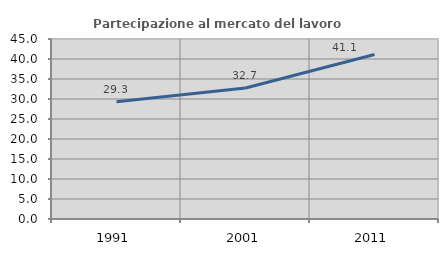
| Category | Partecipazione al mercato del lavoro  femminile |
|---|---|
| 1991.0 | 29.322 |
| 2001.0 | 32.733 |
| 2011.0 | 41.109 |